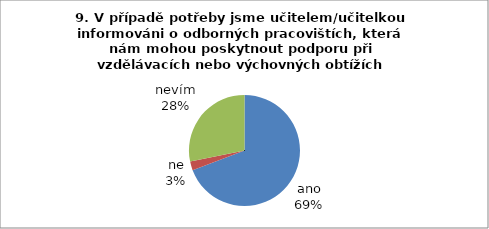
| Category | 9. V případě potřeby jsme učitelem/učitelkou informováni o odborných pracovištích, která nám mohou poskytnout podporu při vzdělávacích nebo výchovných obtížích našeho dítěte. |
|---|---|
| ano | 27 |
| ne | 1 |
| nevím | 11 |